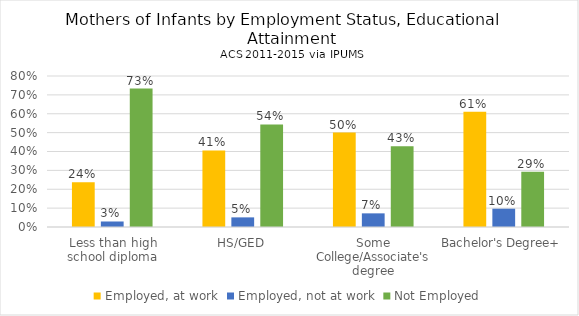
| Category | Employed, at work | Employed, not at work | Not Employed |
|---|---|---|---|
| Less than high school diploma | 0.237 | 0.029 | 0.733 |
| HS/GED | 0.405 | 0.051 | 0.544 |
| Some College/Associate's degree | 0.5 | 0.072 | 0.427 |
| Bachelor's Degree+ | 0.611 | 0.097 | 0.292 |